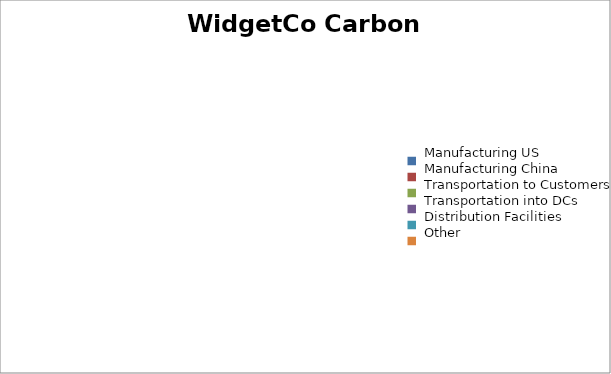
| Category | GHG Emissions _x000d_(tons CO2-eq) |
|---|---|
| Manufacturing US | 0 |
| Manufacturing China | 0 |
| Transportation to Customers | 0 |
| Transportation into DCs | 0 |
| Distribution Facilities | 0 |
| Other | 0 |